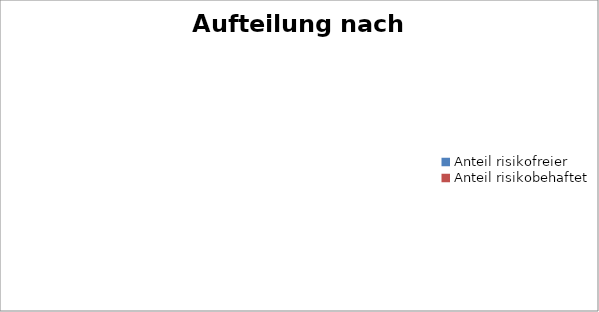
| Category | Series 0 |
|---|---|
| Anteil risikofreier | 0 |
| Anteil risikobehaftet | 0 |